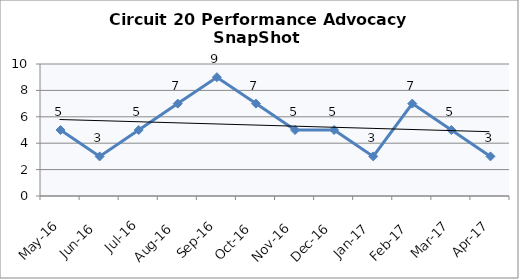
| Category | Circuit 20 |
|---|---|
| May-16 | 5 |
| Jun-16 | 3 |
| Jul-16 | 5 |
| Aug-16 | 7 |
| Sep-16 | 9 |
| Oct-16 | 7 |
| Nov-16 | 5 |
| Dec-16 | 5 |
| Jan-17 | 3 |
| Feb-17 | 7 |
| Mar-17 | 5 |
| Apr-17 | 3 |